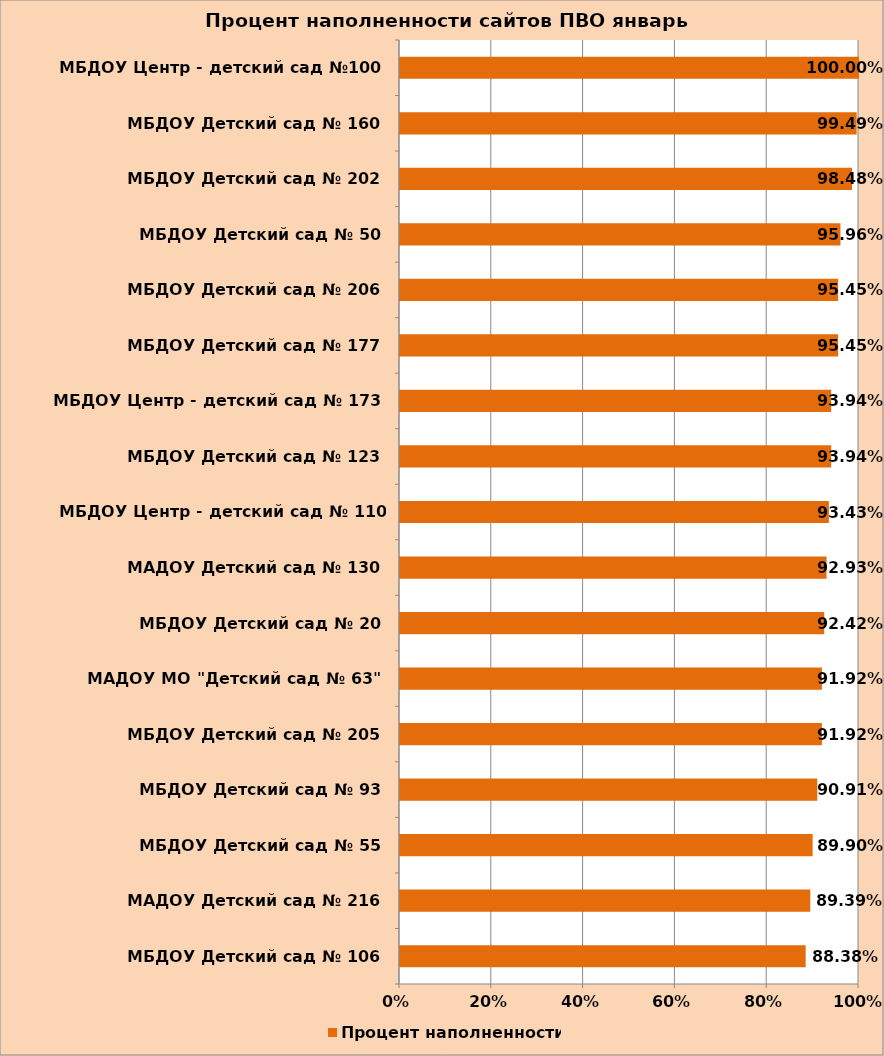
| Category | Процент наполненности |
|---|---|
| МБДОУ Детский сад № 106 | 0.884 |
| МАДОУ Детский сад № 216 | 0.894 |
| МБДОУ Детский сад № 55 | 0.899 |
| МБДОУ Детский сад № 93 | 0.909 |
| МБДОУ Детский сад № 205 | 0.919 |
| МАДОУ МО "Детский сад № 63" | 0.919 |
| МБДОУ Детский сад № 20 | 0.924 |
| МАДОУ Детский сад № 130 | 0.929 |
| МБДОУ Центр - детский сад № 110 Теремок | 0.934 |
| МБДОУ Детский сад № 123 | 0.939 |
| МБДОУ Центр - детский сад № 173 | 0.939 |
| МБДОУ Детский сад № 177 | 0.955 |
| МБДОУ Детский сад № 206 | 0.955 |
| МБДОУ Детский сад № 50 | 0.96 |
| МБДОУ Детский сад № 202 | 0.985 |
| МБДОУ Детский сад № 160 | 0.995 |
| МБДОУ Центр - детский сад №100 | 1 |